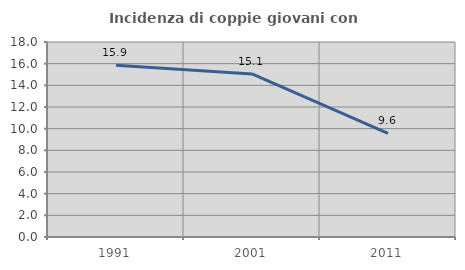
| Category | Incidenza di coppie giovani con figli |
|---|---|
| 1991.0 | 15.854 |
| 2001.0 | 15.054 |
| 2011.0 | 9.565 |